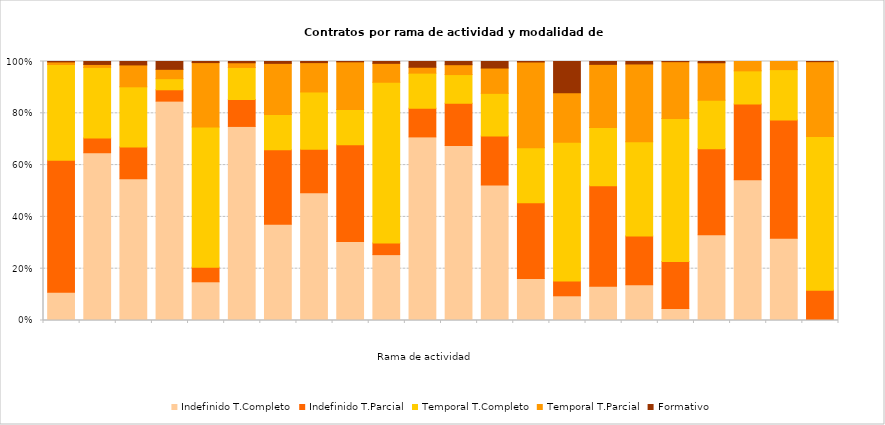
| Category | Indefinido T.Completo | Indefinido T.Parcial | Temporal T.Completo | Temporal T.Parcial | Formativo |
|---|---|---|---|---|---|
|  | 556 | 2600 | 1884 | 51 | 8 |
|  | 57 | 5 | 24 | 1 | 1 |
|  | 12711 | 2855 | 5399 | 1964 | 307 |
|  | 869 | 45 | 44 | 37 | 31 |
|  | 776 | 293 | 2812 | 1289 | 22 |
|  | 43285 | 5999 | 7163 | 1040 | 282 |
|  | 35919 | 27787 | 13062 | 19104 | 691 |
|  | 22067 | 7545 | 9892 | 5075 | 192 |
|  | 44884 | 55059 | 20113 | 27132 | 193 |
|  | 25101 | 4419 | 61263 | 7203 | 703 |
|  | 7796 | 1216 | 1492 | 250 | 244 |
|  | 4110 | 994 | 674 | 232 | 75 |
|  | 31686 | 11448 | 9943 | 5920 | 1525 |
|  | 19963 | 35929 | 26006 | 40680 | 234 |
|  | 563 | 335 | 3164 | 1128 | 712 |
|  | 6450 | 18951 | 10996 | 11932 | 539 |
|  | 8715 | 11804 | 22941 | 18877 | 598 |
|  | 3366 | 13179 | 39976 | 15932 | 49 |
|  | 6060 | 6078 | 3409 | 2658 | 87 |
|  | 18366 | 9870 | 4337 | 1219 | 0 |
|  | 111 | 160 | 68 | 11 | 0 |
|  | 179 | 14962 | 76578 | 37363 | 86 |